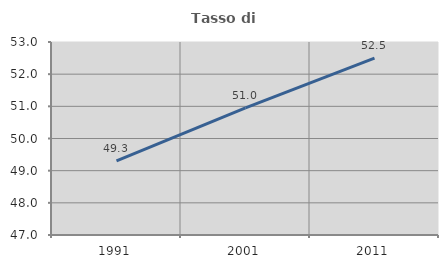
| Category | Tasso di occupazione   |
|---|---|
| 1991.0 | 49.303 |
| 2001.0 | 50.95 |
| 2011.0 | 52.497 |